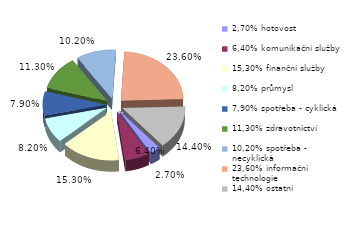
| Category | Series 0 |
|---|---|
| 2,70% hotovost | 0.027 |
| 6,40% komunikační služby | 0.064 |
| 15,30% finanční služby | 0.153 |
| 8,20% průmysl | 0.082 |
| 7,90% spotřeba - cyklická | 0.079 |
| 11,30% zdravotnictví | 0.113 |
| 10,20% spotřeba - necyklická | 0.102 |
| 23,60% informační technologie | 0.236 |
| 14,40% ostatní | 0.144 |